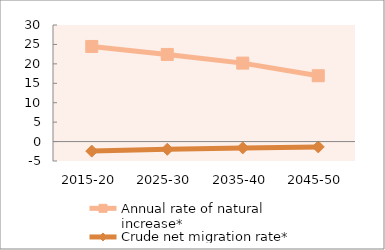
| Category | Annual rate of natural increase* | Crude net migration rate* |
|---|---|---|
| 2015-20 | 24.477 | -2.454 |
| 2025-30 | 22.417 | -1.988 |
| 2035-40 | 20.194 | -1.634 |
| 2045-50 | 16.941 | -1.378 |